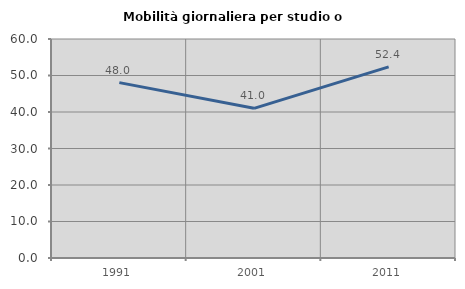
| Category | Mobilità giornaliera per studio o lavoro |
|---|---|
| 1991.0 | 48.05 |
| 2001.0 | 41.007 |
| 2011.0 | 52.381 |